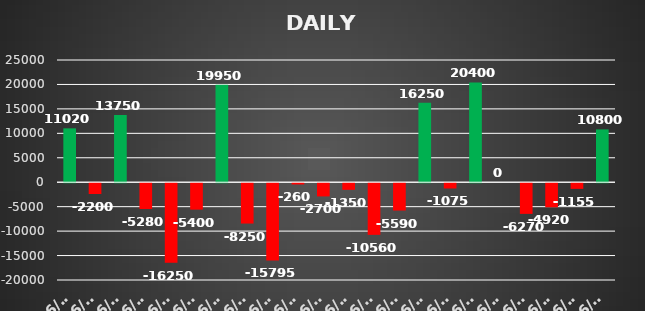
| Category | Series 0 |
|---|---|
| 2022-06-01 | 11020 |
| 2022-06-02 | -2200 |
| 2022-06-02 | 13750 |
| 2022-06-03 | -5280 |
| 2022-06-06 | -16250 |
| 2022-06-07 | -5400 |
| 2022-06-08 | 19950 |
| 2022-06-09 | -8250 |
| 2022-06-10 | -15795 |
| 2022-06-13 | -260 |
| 2022-06-14 | -2700 |
| 2022-06-15 | -1350 |
| 2022-06-16 | -10560 |
| 2022-06-17 | -5590 |
| 2022-06-20 | 16250 |
| 2022-06-22 | -1075 |
| 2022-06-23 | 20400 |
| 2022-06-24 | 0 |
| 2022-06-27 | -6270 |
| 2022-06-28 | -4920 |
| 2022-06-29 | -1155 |
| 2022-06-30 | 10800 |